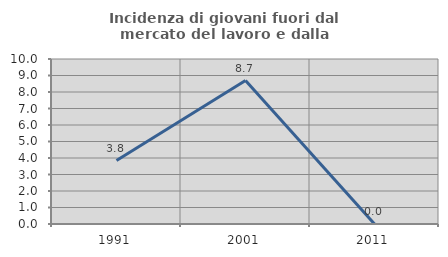
| Category | Incidenza di giovani fuori dal mercato del lavoro e dalla formazione  |
|---|---|
| 1991.0 | 3.846 |
| 2001.0 | 8.696 |
| 2011.0 | 0 |